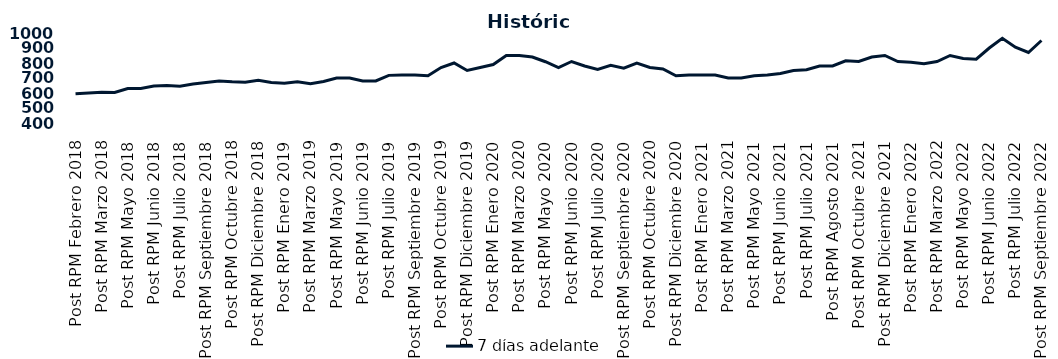
| Category | 7 días adelante  |
|---|---|
| Post RPM Febrero 2018 | 595 |
| Pre RPM Marzo 2018 | 600 |
| Post RPM Marzo 2018 | 605 |
| Pre RPM Mayo 2018 | 603 |
| Post RPM Mayo 2018 | 630 |
| Pre RPM Junio 2018 | 630 |
| Post RPM Junio 2018 | 646.5 |
| Pre RPM Julio 2018 | 650 |
| Post RPM Julio 2018 | 645 |
| Pre RPM Septiembre 2018 | 660 |
| Post RPM Septiembre 2018 | 670 |
| Pre RPM Octubre 2018 | 680 |
| Post RPM Octubre 2018 | 675 |
| Pre RPM Diciembre 2018 | 672.5 |
| Post RPM Diciembre 2018 | 685 |
| Pre RPM Enero 2019 | 670 |
| Post RPM Enero 2019 | 665 |
| Pre RPM Marzo 2019 | 675 |
| Post RPM Marzo 2019 | 661 |
| Pre RPM Mayo 2019 | 677 |
| Post RPM Mayo 2019 | 700 |
| Pre RPM Junio 2019 | 700.5 |
| Post RPM Junio 2019 | 680 |
| Pre RPM Julio 2019 | 680 |
| Post RPM Julio 2019 | 717.5 |
| Pre RPM Septiembre 2019 | 720 |
| Post RPM Septiembre 2019 | 720 |
| Pre RPM Octubre 2019 | 715 |
| Post RPM Octubre 2019 | 770 |
| Pre RPM Diciembre 2019 | 800 |
| Post RPM Diciembre 2019 | 750 |
| Pre RPM Enero 2020 | 770 |
| Post RPM Enero 2020 | 790 |
| Pre RPM Marzo 2020 | 850 |
| Post RPM Marzo 2020 | 850 |
| Pre RPM Mayo 2020 | 840 |
| Post RPM Mayo 2020 | 808.5 |
| Pre RPM Junio 2020 | 770 |
| Post RPM Junio 2020 | 810 |
| Pre RPM Julio 2020 | 780 |
| Post RPM Julio 2020 | 757 |
| Pre RPM Septiembre 2020 | 785 |
| Post RPM Septiembre 2020 | 765 |
| Pre RPM Octubre 2020 | 800 |
| Post RPM Octubre 2020 | 770 |
| Pre RPM Diciembre 2020 | 760 |
| Post RPM Diciembre 2020 | 715 |
| Pre RPM Enero 2021 | 720 |
| Post RPM Enero 2021 | 720 |
| Pre RPM Marzo 2021 | 720 |
| Post RPM Marzo 2021 | 700 |
| Pre RPM Mayo 2021 | 700 |
| Post RPM Mayo 2021 | 715 |
| Pre RPM Junio 2021 | 720 |
| Post RPM Junio 2021 | 730 |
| Pre RPM Julio 2021 | 750 |
| Post RPM Julio 2021 | 755 |
| Pre RPM Agosto 2021 | 780 |
| Post RPM Agosto 2021 | 780 |
| Pre RPM Octubre 2021 | 815 |
| Post RPM Octubre 2021 | 810 |
| Pre RPM Diciembre 2021 | 840 |
| Post RPM Diciembre 2021 | 850 |
| Pre RPM Enero 2022 | 810 |
| Post RPM Enero 2022 | 805 |
| Pre RPM Marzo 2022 | 795 |
| Post RPM Marzo 2022 | 810 |
| Pre RPM Mayo 2022 | 850 |
| Post RPM Mayo 2022 | 830 |
| Pre RPM Junio 2022 | 825 |
| Post RPM Junio 2022 | 900 |
| Pre RPM Julio 2022 | 965 |
| Post RPM Julio 2022 | 905 |
| Pre RPM Septiembre 2022 | 870 |
| Post RPM Septiembre 2022 | 950 |